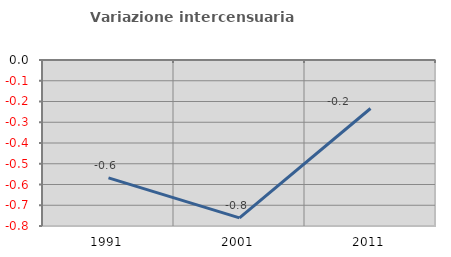
| Category | Variazione intercensuaria annua |
|---|---|
| 1991.0 | -0.568 |
| 2001.0 | -0.761 |
| 2011.0 | -0.234 |